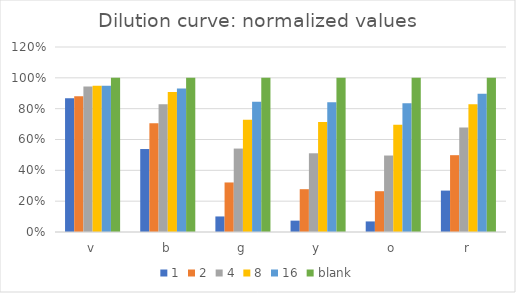
| Category | 1 | 2 | 4 | 8 | 16 | blank |
|---|---|---|---|---|---|---|
| v | 0.868 | 0.881 | 0.943 | 0.948 | 0.949 | 1 |
| b | 0.538 | 0.706 | 0.829 | 0.908 | 0.931 | 1 |
| g | 0.101 | 0.321 | 0.541 | 0.727 | 0.846 | 1 |
| y | 0.074 | 0.278 | 0.511 | 0.713 | 0.841 | 1 |
| o | 0.069 | 0.265 | 0.496 | 0.696 | 0.835 | 1 |
| r | 0.269 | 0.498 | 0.678 | 0.829 | 0.897 | 1 |